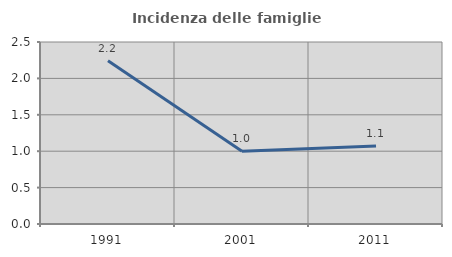
| Category | Incidenza delle famiglie numerose |
|---|---|
| 1991.0 | 2.244 |
| 2001.0 | 1 |
| 2011.0 | 1.071 |